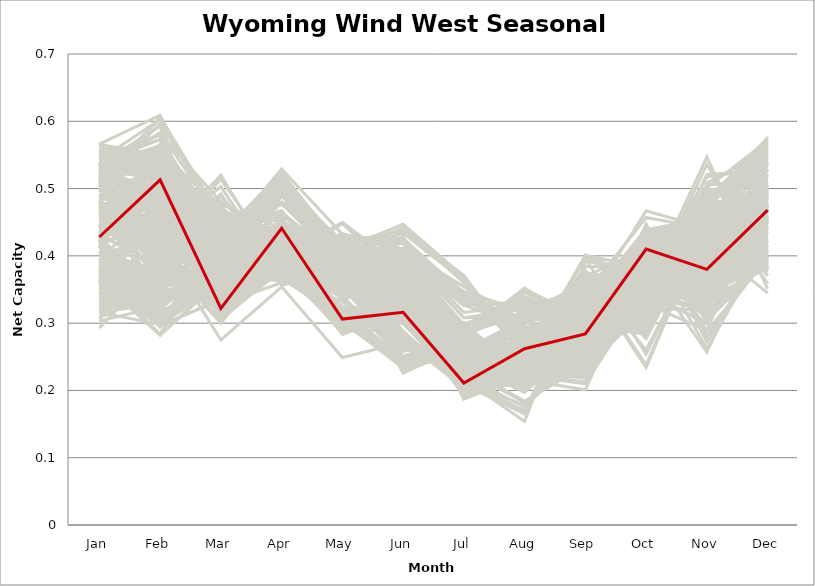
| Category | sample_001 | sample_002 | sample_003 | sample_004 | sample_005 | sample_006 | sample_007 | sample_008 | sample_009 | sample_010 | sample_011 | sample_012 | sample_013 | sample_014 | sample_015 | sample_016 | sample_017 | sample_018 | sample_019 | sample_020 | sample_021 | sample_022 | sample_023 | sample_024 | sample_025 | sample_026 | sample_027 | sample_028 | sample_029 | sample_030 | sample_031 | sample_032 | sample_033 | sample_034 | sample_035 | sample_036 | sample_037 | sample_038 | sample_039 | sample_040 | sample_041 | sample_042 | sample_043 | sample_044 | sample_045 | sample_046 | sample_047 | sample_048 | sample_049 | sample_050 | sample_051 | sample_052 | sample_053 | sample_054 | sample_055 | sample_056 | sample_057 | sample_058 | sample_059 | sample_060 | sample_061 | sample_062 | sample_063 | sample_064 | sample_065 | sample_066 | sample_067 | sample_068 | sample_069 | sample_070 | sample_071 | sample_072 | sample_073 | sample_074 | sample_075 | sample_076 | sample_077 | sample_078 | sample_079 | sample_080 | sample_081 | sample_082 | sample_083 | sample_084 | sample_085 | sample_086 | sample_087 | sample_088 | sample_089 | sample_090 | sample_091 | sample_092 | sample_093 | sample_094 | sample_095 | sample_096 | sample_097 | sample_098 | sample_099 | sample_100 | sample_101 | sample_102 | sample_103 | sample_104 | sample_105 | sample_106 | sample_107 | sample_108 | sample_109 | sample_110 | sample_111 | sample_112 | sample_113 | sample_114 | sample_115 | sample_116 | sample_117 | sample_118 | sample_119 | sample_120 | sample_121 | sample_122 | sample_123 | sample_124 | sample_125 | sample_126 | sample_127 | sample_128 | sample_129 | sample_130 | sample_131 | sample_132 | sample_133 | sample_134 | sample_135 | sample_136 | sample_137 | sample_138 | sample_139 | sample_140 | sample_141 | sample_142 | sample_143 | sample_144 | sample_145 | sample_146 | sample_147 | sample_148 | sample_149 | sample_150 | sample_151 | sample_152 | sample_153 | sample_154 | sample_155 | sample_156 | sample_157 | sample_158 | sample_159 | sample_160 | sample_161 | sample_162 | sample_163 | sample_164 | sample_165 | sample_166 | sample_167 | sample_168 | sample_169 | sample_170 | sample_171 | sample_172 | sample_173 | sample_174 | sample_175 | sample_176 | sample_177 | sample_178 | sample_179 | sample_180 | sample_181 | sample_182 | sample_183 | sample_184 | sample_185 | sample_186 | sample_187 | sample_188 | sample_189 | sample_190 | sample_191 | sample_192 | sample_193 | sample_194 | sample_195 | sample_196 | sample_197 | sample_198 | sample_199 | sample_200 | sample_201 | sample_202 | sample_203 | sample_204 | sample_205 | sample_206 | sample_207 | sample_208 | sample_209 | sample_210 | sample_211 | sample_212 | sample_213 | sample_214 | sample_215 | sample_216 | sample_217 | sample_218 | sample_219 | sample_220 | sample_221 | sample_222 | sample_223 | sample_224 | sample_225 | sample_226 | sample_227 | sample_228 | sample_229 | sample_230 | sample_231 | sample_232 | sample_233 | sample_234 | sample_235 | sample_236 | sample_237 | sample_238 | sample_239 | sample_240 | sample_241 | sample_242 | sample_243 | sample_244 | sample_245 | sample_246 | sample_248 | sample_249 | sample_250 | sample_247 |
|---|---|---|---|---|---|---|---|---|---|---|---|---|---|---|---|---|---|---|---|---|---|---|---|---|---|---|---|---|---|---|---|---|---|---|---|---|---|---|---|---|---|---|---|---|---|---|---|---|---|---|---|---|---|---|---|---|---|---|---|---|---|---|---|---|---|---|---|---|---|---|---|---|---|---|---|---|---|---|---|---|---|---|---|---|---|---|---|---|---|---|---|---|---|---|---|---|---|---|---|---|---|---|---|---|---|---|---|---|---|---|---|---|---|---|---|---|---|---|---|---|---|---|---|---|---|---|---|---|---|---|---|---|---|---|---|---|---|---|---|---|---|---|---|---|---|---|---|---|---|---|---|---|---|---|---|---|---|---|---|---|---|---|---|---|---|---|---|---|---|---|---|---|---|---|---|---|---|---|---|---|---|---|---|---|---|---|---|---|---|---|---|---|---|---|---|---|---|---|---|---|---|---|---|---|---|---|---|---|---|---|---|---|---|---|---|---|---|---|---|---|---|---|---|---|---|---|---|---|---|---|---|---|---|---|---|---|---|---|---|---|---|---|---|---|---|---|---|---|---|---|
| Jan | 0.439 | 0.403 | 0.508 | 0.536 | 0.519 | 0.49 | 0.314 | 0.431 | 0.503 | 0.485 | 0.528 | 0.343 | 0.519 | 0.53 | 0.432 | 0.317 | 0.362 | 0.474 | 0.412 | 0.488 | 0.425 | 0.335 | 0.303 | 0.412 | 0.434 | 0.425 | 0.558 | 0.542 | 0.314 | 0.537 | 0.432 | 0.506 | 0.36 | 0.527 | 0.361 | 0.348 | 0.324 | 0.308 | 0.432 | 0.45 | 0.556 | 0.521 | 0.535 | 0.356 | 0.546 | 0.331 | 0.432 | 0.437 | 0.462 | 0.386 | 0.343 | 0.345 | 0.478 | 0.53 | 0.373 | 0.467 | 0.444 | 0.542 | 0.54 | 0.513 | 0.395 | 0.363 | 0.327 | 0.542 | 0.42 | 0.531 | 0.488 | 0.358 | 0.369 | 0.556 | 0.509 | 0.462 | 0.565 | 0.47 | 0.413 | 0.534 | 0.474 | 0.532 | 0.511 | 0.432 | 0.444 | 0.503 | 0.5 | 0.445 | 0.456 | 0.535 | 0.457 | 0.524 | 0.537 | 0.464 | 0.557 | 0.332 | 0.341 | 0.341 | 0.556 | 0.545 | 0.421 | 0.474 | 0.504 | 0.392 | 0.475 | 0.463 | 0.515 | 0.468 | 0.551 | 0.564 | 0.324 | 0.375 | 0.35 | 0.457 | 0.391 | 0.426 | 0.444 | 0.428 | 0.481 | 0.418 | 0.526 | 0.557 | 0.513 | 0.52 | 0.515 | 0.39 | 0.343 | 0.392 | 0.339 | 0.316 | 0.534 | 0.404 | 0.511 | 0.518 | 0.421 | 0.458 | 0.458 | 0.426 | 0.544 | 0.469 | 0.339 | 0.483 | 0.441 | 0.511 | 0.37 | 0.416 | 0.566 | 0.441 | 0.506 | 0.559 | 0.531 | 0.537 | 0.527 | 0.306 | 0.332 | 0.321 | 0.524 | 0.42 | 0.442 | 0.472 | 0.405 | 0.526 | 0.553 | 0.485 | 0.357 | 0.426 | 0.516 | 0.514 | 0.476 | 0.315 | 0.48 | 0.318 | 0.309 | 0.429 | 0.448 | 0.397 | 0.427 | 0.498 | 0.441 | 0.461 | 0.51 | 0.535 | 0.407 | 0.374 | 0.326 | 0.407 | 0.389 | 0.553 | 0.552 | 0.55 | 0.484 | 0.461 | 0.534 | 0.454 | 0.376 | 0.393 | 0.535 | 0.442 | 0.383 | 0.343 | 0.366 | 0.334 | 0.293 | 0.566 | 0.416 | 0.408 | 0.469 | 0.499 | 0.316 | 0.519 | 0.54 | 0.48 | 0.434 | 0.498 | 0.5 | 0.368 | 0.376 | 0.423 | 0.531 | 0.415 | 0.503 | 0.376 | 0.322 | 0.42 | 0.537 | 0.525 | 0.364 | 0.534 | 0.511 | 0.527 | 0.554 | 0.517 | 0.525 | 0.378 | 0.46 | 0.46 | 0.456 | 0.527 | 0.548 | 0.372 | 0.555 | 0.526 | 0.414 | 0.421 | 0.424 | 0.535 | 0.378 | 0.472 | 0.441 | 0.333 | 0.529 | 0.375 | 0.535 | 0.428 |
| Feb | 0.423 | 0.323 | 0.502 | 0.398 | 0.557 | 0.566 | 0.337 | 0.523 | 0.606 | 0.475 | 0.561 | 0.401 | 0.402 | 0.467 | 0.558 | 0.339 | 0.467 | 0.381 | 0.53 | 0.534 | 0.33 | 0.382 | 0.325 | 0.476 | 0.487 | 0.316 | 0.523 | 0.555 | 0.349 | 0.573 | 0.382 | 0.389 | 0.472 | 0.395 | 0.304 | 0.4 | 0.355 | 0.349 | 0.299 | 0.477 | 0.532 | 0.536 | 0.389 | 0.305 | 0.53 | 0.365 | 0.559 | 0.486 | 0.401 | 0.311 | 0.387 | 0.375 | 0.474 | 0.548 | 0.33 | 0.487 | 0.507 | 0.603 | 0.547 | 0.395 | 0.381 | 0.295 | 0.375 | 0.534 | 0.442 | 0.403 | 0.502 | 0.323 | 0.3 | 0.531 | 0.393 | 0.45 | 0.523 | 0.414 | 0.334 | 0.554 | 0.426 | 0.525 | 0.606 | 0.385 | 0.532 | 0.554 | 0.395 | 0.556 | 0.444 | 0.582 | 0.462 | 0.392 | 0.445 | 0.39 | 0.523 | 0.39 | 0.387 | 0.341 | 0.543 | 0.579 | 0.514 | 0.43 | 0.559 | 0.306 | 0.497 | 0.442 | 0.535 | 0.363 | 0.541 | 0.541 | 0.351 | 0.305 | 0.466 | 0.511 | 0.441 | 0.536 | 0.454 | 0.498 | 0.363 | 0.36 | 0.398 | 0.538 | 0.408 | 0.424 | 0.54 | 0.294 | 0.321 | 0.332 | 0.371 | 0.329 | 0.489 | 0.307 | 0.382 | 0.434 | 0.556 | 0.43 | 0.409 | 0.506 | 0.512 | 0.393 | 0.38 | 0.412 | 0.395 | 0.431 | 0.309 | 0.297 | 0.549 | 0.564 | 0.389 | 0.55 | 0.544 | 0.429 | 0.498 | 0.399 | 0.359 | 0.346 | 0.487 | 0.307 | 0.534 | 0.432 | 0.42 | 0.526 | 0.545 | 0.529 | 0.315 | 0.469 | 0.399 | 0.498 | 0.422 | 0.333 | 0.434 | 0.332 | 0.349 | 0.543 | 0.401 | 0.318 | 0.344 | 0.419 | 0.443 | 0.412 | 0.503 | 0.533 | 0.328 | 0.283 | 0.335 | 0.352 | 0.324 | 0.458 | 0.572 | 0.538 | 0.395 | 0.343 | 0.518 | 0.472 | 0.455 | 0.484 | 0.593 | 0.405 | 0.333 | 0.342 | 0.319 | 0.336 | 0.388 | 0.609 | 0.346 | 0.375 | 0.42 | 0.561 | 0.298 | 0.483 | 0.418 | 0.344 | 0.515 | 0.598 | 0.368 | 0.284 | 0.482 | 0.342 | 0.552 | 0.296 | 0.397 | 0.406 | 0.367 | 0.496 | 0.474 | 0.519 | 0.282 | 0.516 | 0.5 | 0.49 | 0.453 | 0.536 | 0.52 | 0.472 | 0.471 | 0.45 | 0.43 | 0.515 | 0.55 | 0.444 | 0.537 | 0.583 | 0.36 | 0.525 | 0.511 | 0.446 | 0.329 | 0.391 | 0.435 | 0.371 | 0.548 | 0.327 | 0.564 | 0.513 |
| Mar | 0.39 | 0.41 | 0.337 | 0.472 | 0.451 | 0.441 | 0.332 | 0.34 | 0.458 | 0.448 | 0.329 | 0.355 | 0.431 | 0.33 | 0.335 | 0.402 | 0.46 | 0.444 | 0.332 | 0.306 | 0.357 | 0.322 | 0.418 | 0.328 | 0.335 | 0.355 | 0.393 | 0.47 | 0.424 | 0.319 | 0.349 | 0.424 | 0.318 | 0.399 | 0.402 | 0.349 | 0.395 | 0.429 | 0.354 | 0.372 | 0.402 | 0.46 | 0.452 | 0.382 | 0.336 | 0.323 | 0.341 | 0.349 | 0.489 | 0.373 | 0.323 | 0.323 | 0.417 | 0.443 | 0.387 | 0.366 | 0.353 | 0.308 | 0.455 | 0.437 | 0.334 | 0.375 | 0.344 | 0.349 | 0.372 | 0.382 | 0.43 | 0.4 | 0.371 | 0.46 | 0.403 | 0.373 | 0.394 | 0.514 | 0.373 | 0.325 | 0.52 | 0.463 | 0.448 | 0.35 | 0.337 | 0.444 | 0.45 | 0.343 | 0.419 | 0.48 | 0.472 | 0.453 | 0.402 | 0.43 | 0.427 | 0.351 | 0.408 | 0.367 | 0.46 | 0.325 | 0.337 | 0.503 | 0.442 | 0.362 | 0.408 | 0.421 | 0.313 | 0.436 | 0.412 | 0.401 | 0.324 | 0.401 | 0.306 | 0.36 | 0.392 | 0.324 | 0.352 | 0.359 | 0.451 | 0.358 | 0.436 | 0.4 | 0.431 | 0.396 | 0.327 | 0.401 | 0.398 | 0.403 | 0.369 | 0.4 | 0.464 | 0.354 | 0.405 | 0.426 | 0.346 | 0.469 | 0.423 | 0.334 | 0.403 | 0.428 | 0.334 | 0.415 | 0.331 | 0.41 | 0.402 | 0.334 | 0.413 | 0.358 | 0.428 | 0.476 | 0.421 | 0.396 | 0.34 | 0.3 | 0.389 | 0.356 | 0.325 | 0.35 | 0.331 | 0.428 | 0.275 | 0.456 | 0.426 | 0.459 | 0.37 | 0.362 | 0.437 | 0.438 | 0.434 | 0.41 | 0.428 | 0.403 | 0.406 | 0.359 | 0.492 | 0.358 | 0.359 | 0.458 | 0.344 | 0.472 | 0.433 | 0.334 | 0.361 | 0.363 | 0.361 | 0.378 | 0.407 | 0.368 | 0.439 | 0.409 | 0.453 | 0.448 | 0.422 | 0.424 | 0.467 | 0.44 | 0.307 | 0.421 | 0.375 | 0.368 | 0.422 | 0.393 | 0.307 | 0.436 | 0.373 | 0.345 | 0.435 | 0.451 | 0.375 | 0.454 | 0.413 | 0.437 | 0.334 | 0.451 | 0.456 | 0.412 | 0.4 | 0.355 | 0.432 | 0.336 | 0.42 | 0.324 | 0.327 | 0.396 | 0.351 | 0.455 | 0.365 | 0.418 | 0.442 | 0.452 | 0.384 | 0.44 | 0.454 | 0.394 | 0.413 | 0.45 | 0.489 | 0.322 | 0.395 | 0.46 | 0.405 | 0.452 | 0.359 | 0.346 | 0.368 | 0.396 | 0.39 | 0.428 | 0.464 | 0.318 | 0.419 | 0.411 | 0.323 | 0.322 |
| Apr | 0.372 | 0.446 | 0.388 | 0.377 | 0.39 | 0.48 | 0.395 | 0.37 | 0.428 | 0.402 | 0.36 | 0.405 | 0.367 | 0.41 | 0.418 | 0.426 | 0.455 | 0.408 | 0.412 | 0.379 | 0.424 | 0.398 | 0.412 | 0.437 | 0.442 | 0.385 | 0.504 | 0.418 | 0.423 | 0.387 | 0.403 | 0.384 | 0.389 | 0.379 | 0.423 | 0.402 | 0.411 | 0.425 | 0.379 | 0.402 | 0.515 | 0.407 | 0.377 | 0.375 | 0.387 | 0.401 | 0.418 | 0.38 | 0.364 | 0.438 | 0.394 | 0.407 | 0.394 | 0.406 | 0.361 | 0.396 | 0.376 | 0.402 | 0.417 | 0.405 | 0.405 | 0.376 | 0.417 | 0.384 | 0.489 | 0.426 | 0.415 | 0.372 | 0.379 | 0.425 | 0.377 | 0.492 | 0.494 | 0.385 | 0.446 | 0.376 | 0.371 | 0.422 | 0.423 | 0.407 | 0.452 | 0.419 | 0.393 | 0.386 | 0.394 | 0.418 | 0.396 | 0.392 | 0.41 | 0.385 | 0.514 | 0.403 | 0.401 | 0.392 | 0.41 | 0.412 | 0.438 | 0.367 | 0.375 | 0.444 | 0.401 | 0.497 | 0.391 | 0.384 | 0.505 | 0.511 | 0.396 | 0.43 | 0.399 | 0.386 | 0.479 | 0.425 | 0.368 | 0.371 | 0.388 | 0.402 | 0.397 | 0.497 | 0.399 | 0.424 | 0.378 | 0.409 | 0.387 | 0.444 | 0.408 | 0.414 | 0.402 | 0.442 | 0.385 | 0.385 | 0.414 | 0.393 | 0.492 | 0.445 | 0.497 | 0.478 | 0.404 | 0.506 | 0.406 | 0.378 | 0.432 | 0.385 | 0.517 | 0.396 | 0.376 | 0.441 | 0.508 | 0.418 | 0.408 | 0.414 | 0.432 | 0.393 | 0.395 | 0.388 | 0.46 | 0.495 | 0.354 | 0.395 | 0.524 | 0.438 | 0.368 | 0.403 | 0.388 | 0.405 | 0.381 | 0.395 | 0.384 | 0.417 | 0.433 | 0.423 | 0.356 | 0.448 | 0.413 | 0.385 | 0.413 | 0.398 | 0.479 | 0.395 | 0.441 | 0.432 | 0.399 | 0.388 | 0.441 | 0.431 | 0.467 | 0.513 | 0.382 | 0.382 | 0.516 | 0.388 | 0.435 | 0.464 | 0.381 | 0.529 | 0.376 | 0.398 | 0.367 | 0.422 | 0.413 | 0.467 | 0.393 | 0.432 | 0.384 | 0.476 | 0.366 | 0.403 | 0.411 | 0.381 | 0.457 | 0.436 | 0.369 | 0.426 | 0.462 | 0.423 | 0.523 | 0.377 | 0.386 | 0.401 | 0.394 | 0.489 | 0.434 | 0.38 | 0.364 | 0.516 | 0.391 | 0.41 | 0.443 | 0.489 | 0.398 | 0.465 | 0.527 | 0.41 | 0.391 | 0.379 | 0.5 | 0.451 | 0.508 | 0.403 | 0.4 | 0.376 | 0.366 | 0.418 | 0.377 | 0.375 | 0.373 | 0.407 | 0.517 | 0.433 | 0.378 | 0.441 |
| May | 0.432 | 0.362 | 0.358 | 0.306 | 0.345 | 0.423 | 0.433 | 0.315 | 0.377 | 0.38 | 0.405 | 0.41 | 0.332 | 0.325 | 0.317 | 0.392 | 0.367 | 0.301 | 0.308 | 0.416 | 0.403 | 0.429 | 0.407 | 0.317 | 0.303 | 0.365 | 0.406 | 0.357 | 0.404 | 0.389 | 0.392 | 0.393 | 0.448 | 0.379 | 0.387 | 0.406 | 0.403 | 0.392 | 0.378 | 0.292 | 0.404 | 0.363 | 0.321 | 0.38 | 0.355 | 0.422 | 0.316 | 0.289 | 0.392 | 0.407 | 0.427 | 0.432 | 0.359 | 0.353 | 0.393 | 0.283 | 0.293 | 0.375 | 0.345 | 0.377 | 0.407 | 0.365 | 0.406 | 0.389 | 0.409 | 0.399 | 0.393 | 0.391 | 0.361 | 0.349 | 0.352 | 0.379 | 0.391 | 0.378 | 0.388 | 0.378 | 0.382 | 0.364 | 0.379 | 0.399 | 0.305 | 0.362 | 0.299 | 0.308 | 0.371 | 0.347 | 0.365 | 0.303 | 0.388 | 0.38 | 0.391 | 0.416 | 0.402 | 0.395 | 0.342 | 0.388 | 0.316 | 0.377 | 0.362 | 0.406 | 0.402 | 0.361 | 0.389 | 0.406 | 0.422 | 0.419 | 0.404 | 0.379 | 0.45 | 0.285 | 0.411 | 0.304 | 0.304 | 0.305 | 0.313 | 0.415 | 0.377 | 0.414 | 0.378 | 0.399 | 0.39 | 0.393 | 0.378 | 0.371 | 0.397 | 0.392 | 0.355 | 0.409 | 0.355 | 0.361 | 0.308 | 0.368 | 0.36 | 0.305 | 0.41 | 0.387 | 0.422 | 0.406 | 0.397 | 0.362 | 0.386 | 0.385 | 0.416 | 0.318 | 0.34 | 0.428 | 0.404 | 0.395 | 0.335 | 0.42 | 0.4 | 0.417 | 0.352 | 0.366 | 0.296 | 0.358 | 0.249 | 0.354 | 0.405 | 0.426 | 0.379 | 0.291 | 0.339 | 0.36 | 0.365 | 0.388 | 0.365 | 0.403 | 0.407 | 0.3 | 0.384 | 0.409 | 0.407 | 0.369 | 0.385 | 0.363 | 0.423 | 0.358 | 0.396 | 0.395 | 0.404 | 0.415 | 0.375 | 0.39 | 0.344 | 0.409 | 0.362 | 0.311 | 0.404 | 0.367 | 0.365 | 0.382 | 0.385 | 0.432 | 0.377 | 0.398 | 0.382 | 0.395 | 0.41 | 0.356 | 0.405 | 0.386 | 0.377 | 0.418 | 0.392 | 0.369 | 0.392 | 0.317 | 0.306 | 0.377 | 0.321 | 0.391 | 0.385 | 0.405 | 0.409 | 0.382 | 0.398 | 0.431 | 0.403 | 0.399 | 0.306 | 0.371 | 0.37 | 0.402 | 0.369 | 0.346 | 0.396 | 0.415 | 0.352 | 0.391 | 0.345 | 0.377 | 0.38 | 0.397 | 0.409 | 0.381 | 0.416 | 0.337 | 0.414 | 0.314 | 0.309 | 0.393 | 0.38 | 0.392 | 0.365 | 0.404 | 0.411 | 0.367 | 0.39 | 0.306 |
| Jun | 0.372 | 0.322 | 0.281 | 0.239 | 0.344 | 0.34 | 0.41 | 0.299 | 0.382 | 0.339 | 0.287 | 0.411 | 0.258 | 0.267 | 0.315 | 0.401 | 0.399 | 0.237 | 0.325 | 0.284 | 0.343 | 0.423 | 0.394 | 0.342 | 0.331 | 0.359 | 0.362 | 0.391 | 0.389 | 0.278 | 0.409 | 0.365 | 0.367 | 0.242 | 0.321 | 0.399 | 0.406 | 0.392 | 0.358 | 0.287 | 0.37 | 0.375 | 0.247 | 0.335 | 0.275 | 0.419 | 0.311 | 0.314 | 0.325 | 0.313 | 0.426 | 0.406 | 0.354 | 0.352 | 0.368 | 0.317 | 0.31 | 0.322 | 0.367 | 0.403 | 0.359 | 0.346 | 0.4 | 0.316 | 0.331 | 0.24 | 0.342 | 0.336 | 0.356 | 0.35 | 0.259 | 0.314 | 0.364 | 0.341 | 0.327 | 0.274 | 0.342 | 0.372 | 0.377 | 0.408 | 0.328 | 0.367 | 0.242 | 0.304 | 0.362 | 0.385 | 0.349 | 0.233 | 0.247 | 0.364 | 0.383 | 0.404 | 0.4 | 0.4 | 0.361 | 0.32 | 0.324 | 0.331 | 0.347 | 0.311 | 0.332 | 0.325 | 0.281 | 0.378 | 0.395 | 0.372 | 0.442 | 0.31 | 0.381 | 0.323 | 0.364 | 0.31 | 0.317 | 0.308 | 0.244 | 0.36 | 0.396 | 0.386 | 0.361 | 0.24 | 0.285 | 0.31 | 0.336 | 0.318 | 0.402 | 0.4 | 0.352 | 0.309 | 0.25 | 0.265 | 0.322 | 0.339 | 0.333 | 0.336 | 0.37 | 0.321 | 0.395 | 0.311 | 0.419 | 0.264 | 0.33 | 0.356 | 0.369 | 0.316 | 0.251 | 0.328 | 0.365 | 0.236 | 0.273 | 0.437 | 0.388 | 0.407 | 0.273 | 0.358 | 0.331 | 0.324 | 0.271 | 0.367 | 0.354 | 0.313 | 0.353 | 0.3 | 0.247 | 0.348 | 0.357 | 0.385 | 0.362 | 0.395 | 0.401 | 0.314 | 0.333 | 0.309 | 0.353 | 0.361 | 0.429 | 0.314 | 0.345 | 0.279 | 0.341 | 0.31 | 0.409 | 0.377 | 0.314 | 0.238 | 0.354 | 0.381 | 0.352 | 0.241 | 0.36 | 0.353 | 0.393 | 0.386 | 0.309 | 0.332 | 0.351 | 0.408 | 0.348 | 0.391 | 0.447 | 0.354 | 0.372 | 0.354 | 0.368 | 0.342 | 0.325 | 0.375 | 0.231 | 0.239 | 0.35 | 0.374 | 0.241 | 0.322 | 0.377 | 0.352 | 0.363 | 0.351 | 0.377 | 0.367 | 0.441 | 0.353 | 0.282 | 0.344 | 0.349 | 0.376 | 0.344 | 0.353 | 0.232 | 0.346 | 0.338 | 0.37 | 0.32 | 0.351 | 0.341 | 0.311 | 0.394 | 0.403 | 0.374 | 0.349 | 0.397 | 0.307 | 0.321 | 0.226 | 0.338 | 0.359 | 0.325 | 0.434 | 0.383 | 0.317 | 0.288 | 0.316 |
| Jul | 0.258 | 0.255 | 0.213 | 0.285 | 0.246 | 0.238 | 0.354 | 0.208 | 0.234 | 0.255 | 0.209 | 0.336 | 0.281 | 0.216 | 0.193 | 0.294 | 0.223 | 0.283 | 0.204 | 0.203 | 0.258 | 0.343 | 0.283 | 0.211 | 0.215 | 0.275 | 0.255 | 0.231 | 0.277 | 0.204 | 0.246 | 0.212 | 0.259 | 0.266 | 0.266 | 0.327 | 0.308 | 0.278 | 0.282 | 0.206 | 0.26 | 0.221 | 0.278 | 0.225 | 0.204 | 0.338 | 0.193 | 0.215 | 0.255 | 0.271 | 0.344 | 0.345 | 0.191 | 0.255 | 0.232 | 0.197 | 0.208 | 0.192 | 0.219 | 0.225 | 0.28 | 0.263 | 0.334 | 0.209 | 0.21 | 0.268 | 0.254 | 0.22 | 0.248 | 0.252 | 0.267 | 0.217 | 0.25 | 0.244 | 0.264 | 0.205 | 0.258 | 0.232 | 0.229 | 0.246 | 0.199 | 0.233 | 0.29 | 0.213 | 0.196 | 0.225 | 0.25 | 0.287 | 0.261 | 0.205 | 0.257 | 0.344 | 0.284 | 0.326 | 0.24 | 0.202 | 0.205 | 0.24 | 0.242 | 0.276 | 0.248 | 0.226 | 0.204 | 0.204 | 0.255 | 0.267 | 0.36 | 0.267 | 0.253 | 0.205 | 0.209 | 0.2 | 0.216 | 0.213 | 0.295 | 0.247 | 0.231 | 0.265 | 0.194 | 0.263 | 0.217 | 0.272 | 0.227 | 0.256 | 0.308 | 0.298 | 0.233 | 0.266 | 0.269 | 0.25 | 0.198 | 0.247 | 0.228 | 0.216 | 0.255 | 0.223 | 0.355 | 0.208 | 0.251 | 0.268 | 0.271 | 0.284 | 0.253 | 0.205 | 0.282 | 0.283 | 0.24 | 0.258 | 0.211 | 0.371 | 0.278 | 0.347 | 0.214 | 0.273 | 0.202 | 0.228 | 0.232 | 0.218 | 0.24 | 0.248 | 0.253 | 0.204 | 0.278 | 0.257 | 0.197 | 0.277 | 0.192 | 0.283 | 0.284 | 0.205 | 0.246 | 0.273 | 0.254 | 0.187 | 0.242 | 0.242 | 0.245 | 0.215 | 0.263 | 0.267 | 0.331 | 0.252 | 0.258 | 0.261 | 0.269 | 0.268 | 0.197 | 0.301 | 0.26 | 0.193 | 0.235 | 0.213 | 0.199 | 0.213 | 0.224 | 0.316 | 0.232 | 0.294 | 0.369 | 0.279 | 0.245 | 0.27 | 0.195 | 0.232 | 0.231 | 0.242 | 0.257 | 0.295 | 0.211 | 0.246 | 0.295 | 0.276 | 0.218 | 0.259 | 0.243 | 0.292 | 0.223 | 0.283 | 0.367 | 0.209 | 0.212 | 0.256 | 0.259 | 0.256 | 0.26 | 0.253 | 0.268 | 0.244 | 0.243 | 0.209 | 0.238 | 0.255 | 0.255 | 0.202 | 0.256 | 0.231 | 0.253 | 0.248 | 0.251 | 0.21 | 0.208 | 0.267 | 0.228 | 0.203 | 0.238 | 0.363 | 0.249 | 0.262 | 0.206 | 0.211 |
| Aug | 0.223 | 0.271 | 0.229 | 0.208 | 0.294 | 0.248 | 0.304 | 0.256 | 0.252 | 0.219 | 0.224 | 0.304 | 0.223 | 0.238 | 0.239 | 0.328 | 0.175 | 0.2 | 0.267 | 0.245 | 0.261 | 0.27 | 0.35 | 0.261 | 0.254 | 0.231 | 0.211 | 0.267 | 0.347 | 0.234 | 0.264 | 0.229 | 0.239 | 0.271 | 0.267 | 0.292 | 0.321 | 0.334 | 0.22 | 0.242 | 0.216 | 0.26 | 0.21 | 0.241 | 0.214 | 0.276 | 0.252 | 0.248 | 0.22 | 0.258 | 0.26 | 0.281 | 0.221 | 0.29 | 0.245 | 0.232 | 0.235 | 0.224 | 0.253 | 0.221 | 0.21 | 0.256 | 0.307 | 0.217 | 0.169 | 0.259 | 0.216 | 0.248 | 0.252 | 0.291 | 0.25 | 0.154 | 0.216 | 0.207 | 0.248 | 0.23 | 0.214 | 0.27 | 0.237 | 0.258 | 0.243 | 0.26 | 0.204 | 0.247 | 0.221 | 0.262 | 0.224 | 0.202 | 0.25 | 0.236 | 0.219 | 0.301 | 0.314 | 0.332 | 0.274 | 0.227 | 0.247 | 0.197 | 0.292 | 0.259 | 0.214 | 0.307 | 0.238 | 0.231 | 0.21 | 0.219 | 0.256 | 0.283 | 0.24 | 0.23 | 0.17 | 0.25 | 0.251 | 0.252 | 0.219 | 0.278 | 0.226 | 0.229 | 0.216 | 0.254 | 0.239 | 0.262 | 0.251 | 0.273 | 0.31 | 0.335 | 0.292 | 0.264 | 0.251 | 0.24 | 0.249 | 0.228 | 0.32 | 0.242 | 0.22 | 0.303 | 0.286 | 0.32 | 0.253 | 0.227 | 0.284 | 0.231 | 0.215 | 0.254 | 0.231 | 0.252 | 0.21 | 0.25 | 0.224 | 0.248 | 0.34 | 0.317 | 0.238 | 0.233 | 0.244 | 0.314 | 0.231 | 0.283 | 0.224 | 0.255 | 0.256 | 0.249 | 0.232 | 0.307 | 0.213 | 0.346 | 0.215 | 0.352 | 0.339 | 0.248 | 0.222 | 0.26 | 0.257 | 0.222 | 0.256 | 0.218 | 0.24 | 0.233 | 0.255 | 0.265 | 0.326 | 0.26 | 0.272 | 0.244 | 0.241 | 0.23 | 0.229 | 0.219 | 0.212 | 0.228 | 0.184 | 0.178 | 0.245 | 0.328 | 0.256 | 0.327 | 0.249 | 0.33 | 0.254 | 0.232 | 0.26 | 0.213 | 0.213 | 0.249 | 0.269 | 0.29 | 0.244 | 0.226 | 0.247 | 0.259 | 0.22 | 0.275 | 0.169 | 0.26 | 0.213 | 0.222 | 0.227 | 0.206 | 0.247 | 0.165 | 0.238 | 0.304 | 0.271 | 0.222 | 0.306 | 0.297 | 0.253 | 0.235 | 0.278 | 0.169 | 0.321 | 0.221 | 0.223 | 0.242 | 0.22 | 0.182 | 0.206 | 0.288 | 0.264 | 0.259 | 0.259 | 0.261 | 0.246 | 0.239 | 0.2 | 0.248 | 0.21 | 0.27 | 0.229 | 0.262 |
| Sep | 0.377 | 0.278 | 0.331 | 0.33 | 0.227 | 0.226 | 0.361 | 0.335 | 0.299 | 0.294 | 0.332 | 0.324 | 0.335 | 0.343 | 0.313 | 0.301 | 0.265 | 0.355 | 0.316 | 0.337 | 0.349 | 0.348 | 0.308 | 0.278 | 0.277 | 0.269 | 0.278 | 0.264 | 0.302 | 0.337 | 0.351 | 0.218 | 0.252 | 0.273 | 0.31 | 0.319 | 0.305 | 0.293 | 0.273 | 0.401 | 0.278 | 0.279 | 0.332 | 0.325 | 0.324 | 0.361 | 0.298 | 0.385 | 0.292 | 0.358 | 0.352 | 0.356 | 0.238 | 0.234 | 0.331 | 0.401 | 0.367 | 0.315 | 0.269 | 0.21 | 0.254 | 0.299 | 0.32 | 0.34 | 0.362 | 0.26 | 0.267 | 0.318 | 0.291 | 0.228 | 0.309 | 0.393 | 0.274 | 0.284 | 0.349 | 0.328 | 0.269 | 0.273 | 0.312 | 0.34 | 0.278 | 0.316 | 0.333 | 0.352 | 0.241 | 0.278 | 0.271 | 0.339 | 0.269 | 0.237 | 0.258 | 0.325 | 0.289 | 0.316 | 0.236 | 0.32 | 0.279 | 0.282 | 0.239 | 0.353 | 0.299 | 0.365 | 0.336 | 0.22 | 0.262 | 0.275 | 0.37 | 0.322 | 0.243 | 0.369 | 0.346 | 0.313 | 0.384 | 0.368 | 0.358 | 0.364 | 0.212 | 0.277 | 0.201 | 0.266 | 0.335 | 0.339 | 0.309 | 0.275 | 0.303 | 0.314 | 0.255 | 0.368 | 0.3 | 0.279 | 0.304 | 0.273 | 0.352 | 0.274 | 0.277 | 0.312 | 0.335 | 0.297 | 0.373 | 0.267 | 0.321 | 0.27 | 0.275 | 0.324 | 0.332 | 0.296 | 0.287 | 0.262 | 0.326 | 0.373 | 0.302 | 0.33 | 0.338 | 0.269 | 0.266 | 0.36 | 0.314 | 0.282 | 0.287 | 0.264 | 0.308 | 0.398 | 0.326 | 0.247 | 0.241 | 0.299 | 0.245 | 0.297 | 0.297 | 0.283 | 0.291 | 0.355 | 0.341 | 0.228 | 0.359 | 0.287 | 0.25 | 0.326 | 0.338 | 0.348 | 0.324 | 0.336 | 0.312 | 0.256 | 0.296 | 0.277 | 0.232 | 0.369 | 0.282 | 0.23 | 0.237 | 0.272 | 0.32 | 0.304 | 0.323 | 0.315 | 0.318 | 0.311 | 0.371 | 0.327 | 0.338 | 0.26 | 0.247 | 0.221 | 0.349 | 0.288 | 0.259 | 0.358 | 0.258 | 0.317 | 0.35 | 0.33 | 0.31 | 0.364 | 0.279 | 0.262 | 0.229 | 0.245 | 0.378 | 0.342 | 0.322 | 0.246 | 0.301 | 0.279 | 0.228 | 0.25 | 0.261 | 0.252 | 0.231 | 0.328 | 0.354 | 0.274 | 0.268 | 0.327 | 0.26 | 0.25 | 0.272 | 0.224 | 0.354 | 0.35 | 0.357 | 0.261 | 0.307 | 0.222 | 0.28 | 0.396 | 0.267 | 0.304 | 0.326 | 0.284 |
| Oct | 0.322 | 0.427 | 0.436 | 0.424 | 0.335 | 0.432 | 0.302 | 0.395 | 0.283 | 0.314 | 0.411 | 0.296 | 0.424 | 0.457 | 0.417 | 0.31 | 0.387 | 0.422 | 0.401 | 0.426 | 0.356 | 0.293 | 0.311 | 0.441 | 0.436 | 0.322 | 0.377 | 0.299 | 0.304 | 0.434 | 0.347 | 0.372 | 0.387 | 0.401 | 0.4 | 0.297 | 0.317 | 0.315 | 0.333 | 0.382 | 0.379 | 0.316 | 0.419 | 0.387 | 0.437 | 0.3 | 0.417 | 0.378 | 0.385 | 0.399 | 0.297 | 0.296 | 0.376 | 0.319 | 0.305 | 0.365 | 0.376 | 0.369 | 0.32 | 0.35 | 0.447 | 0.308 | 0.302 | 0.36 | 0.365 | 0.402 | 0.297 | 0.364 | 0.31 | 0.332 | 0.43 | 0.369 | 0.38 | 0.4 | 0.392 | 0.44 | 0.391 | 0.312 | 0.3 | 0.338 | 0.437 | 0.308 | 0.398 | 0.389 | 0.385 | 0.318 | 0.375 | 0.418 | 0.403 | 0.382 | 0.35 | 0.291 | 0.331 | 0.302 | 0.32 | 0.349 | 0.423 | 0.401 | 0.363 | 0.375 | 0.3 | 0.341 | 0.414 | 0.39 | 0.359 | 0.372 | 0.26 | 0.409 | 0.419 | 0.38 | 0.34 | 0.406 | 0.386 | 0.381 | 0.405 | 0.353 | 0.355 | 0.369 | 0.407 | 0.389 | 0.429 | 0.397 | 0.364 | 0.409 | 0.313 | 0.307 | 0.317 | 0.384 | 0.441 | 0.415 | 0.408 | 0.384 | 0.34 | 0.439 | 0.375 | 0.376 | 0.304 | 0.369 | 0.329 | 0.417 | 0.396 | 0.316 | 0.385 | 0.391 | 0.405 | 0.327 | 0.403 | 0.417 | 0.439 | 0.238 | 0.309 | 0.298 | 0.432 | 0.331 | 0.426 | 0.343 | 0.287 | 0.317 | 0.396 | 0.438 | 0.307 | 0.367 | 0.42 | 0.324 | 0.378 | 0.302 | 0.38 | 0.307 | 0.308 | 0.413 | 0.389 | 0.389 | 0.364 | 0.4 | 0.323 | 0.424 | 0.423 | 0.431 | 0.38 | 0.382 | 0.305 | 0.347 | 0.405 | 0.402 | 0.353 | 0.347 | 0.386 | 0.412 | 0.387 | 0.396 | 0.399 | 0.378 | 0.384 | 0.36 | 0.309 | 0.301 | 0.338 | 0.304 | 0.234 | 0.345 | 0.348 | 0.436 | 0.376 | 0.426 | 0.36 | 0.317 | 0.41 | 0.417 | 0.44 | 0.284 | 0.404 | 0.398 | 0.349 | 0.358 | 0.39 | 0.326 | 0.363 | 0.447 | 0.277 | 0.343 | 0.467 | 0.338 | 0.31 | 0.381 | 0.337 | 0.317 | 0.389 | 0.419 | 0.33 | 0.333 | 0.319 | 0.353 | 0.386 | 0.381 | 0.363 | 0.382 | 0.376 | 0.335 | 0.34 | 0.392 | 0.374 | 0.404 | 0.361 | 0.399 | 0.417 | 0.254 | 0.383 | 0.396 | 0.433 | 0.41 |
| Nov | 0.384 | 0.381 | 0.445 | 0.353 | 0.483 | 0.464 | 0.42 | 0.398 | 0.458 | 0.473 | 0.409 | 0.465 | 0.307 | 0.44 | 0.409 | 0.49 | 0.382 | 0.336 | 0.395 | 0.407 | 0.333 | 0.448 | 0.474 | 0.344 | 0.352 | 0.452 | 0.457 | 0.453 | 0.489 | 0.418 | 0.299 | 0.374 | 0.257 | 0.342 | 0.355 | 0.461 | 0.488 | 0.47 | 0.426 | 0.408 | 0.487 | 0.42 | 0.332 | 0.498 | 0.435 | 0.435 | 0.406 | 0.399 | 0.427 | 0.327 | 0.451 | 0.446 | 0.394 | 0.479 | 0.49 | 0.409 | 0.408 | 0.469 | 0.399 | 0.366 | 0.28 | 0.463 | 0.455 | 0.469 | 0.364 | 0.337 | 0.503 | 0.489 | 0.477 | 0.508 | 0.306 | 0.36 | 0.469 | 0.448 | 0.342 | 0.43 | 0.444 | 0.444 | 0.439 | 0.303 | 0.381 | 0.398 | 0.358 | 0.406 | 0.389 | 0.428 | 0.458 | 0.344 | 0.342 | 0.378 | 0.468 | 0.454 | 0.488 | 0.468 | 0.482 | 0.496 | 0.385 | 0.417 | 0.483 | 0.332 | 0.484 | 0.362 | 0.427 | 0.358 | 0.474 | 0.471 | 0.434 | 0.351 | 0.262 | 0.433 | 0.362 | 0.393 | 0.388 | 0.405 | 0.319 | 0.326 | 0.373 | 0.478 | 0.36 | 0.368 | 0.418 | 0.332 | 0.517 | 0.374 | 0.468 | 0.474 | 0.44 | 0.324 | 0.288 | 0.348 | 0.401 | 0.44 | 0.346 | 0.362 | 0.472 | 0.385 | 0.445 | 0.412 | 0.289 | 0.343 | 0.357 | 0.441 | 0.47 | 0.423 | 0.311 | 0.46 | 0.45 | 0.359 | 0.456 | 0.447 | 0.48 | 0.433 | 0.441 | 0.451 | 0.399 | 0.351 | 0.466 | 0.408 | 0.463 | 0.447 | 0.475 | 0.41 | 0.31 | 0.471 | 0.386 | 0.463 | 0.399 | 0.472 | 0.477 | 0.429 | 0.423 | 0.326 | 0.33 | 0.39 | 0.319 | 0.406 | 0.445 | 0.43 | 0.32 | 0.322 | 0.457 | 0.334 | 0.355 | 0.353 | 0.547 | 0.467 | 0.393 | 0.307 | 0.458 | 0.392 | 0.377 | 0.397 | 0.452 | 0.417 | 0.485 | 0.466 | 0.521 | 0.482 | 0.449 | 0.536 | 0.319 | 0.314 | 0.4 | 0.457 | 0.485 | 0.427 | 0.358 | 0.304 | 0.37 | 0.437 | 0.327 | 0.347 | 0.392 | 0.331 | 0.457 | 0.439 | 0.373 | 0.272 | 0.451 | 0.377 | 0.441 | 0.485 | 0.453 | 0.465 | 0.451 | 0.454 | 0.361 | 0.462 | 0.486 | 0.384 | 0.389 | 0.456 | 0.441 | 0.455 | 0.467 | 0.377 | 0.482 | 0.501 | 0.319 | 0.407 | 0.417 | 0.364 | 0.505 | 0.355 | 0.41 | 0.442 | 0.484 | 0.376 | 0.439 | 0.38 |
| Dec | 0.444 | 0.451 | 0.404 | 0.389 | 0.574 | 0.425 | 0.397 | 0.484 | 0.488 | 0.389 | 0.428 | 0.405 | 0.401 | 0.403 | 0.473 | 0.443 | 0.458 | 0.382 | 0.467 | 0.418 | 0.46 | 0.377 | 0.477 | 0.476 | 0.477 | 0.504 | 0.381 | 0.567 | 0.488 | 0.402 | 0.506 | 0.44 | 0.451 | 0.404 | 0.445 | 0.402 | 0.402 | 0.479 | 0.528 | 0.505 | 0.389 | 0.571 | 0.41 | 0.506 | 0.394 | 0.385 | 0.48 | 0.477 | 0.435 | 0.475 | 0.38 | 0.379 | 0.414 | 0.569 | 0.545 | 0.493 | 0.483 | 0.421 | 0.528 | 0.443 | 0.4 | 0.538 | 0.392 | 0.406 | 0.519 | 0.414 | 0.371 | 0.512 | 0.541 | 0.557 | 0.4 | 0.55 | 0.402 | 0.456 | 0.474 | 0.402 | 0.433 | 0.563 | 0.474 | 0.496 | 0.478 | 0.488 | 0.4 | 0.501 | 0.404 | 0.539 | 0.411 | 0.387 | 0.413 | 0.43 | 0.383 | 0.404 | 0.424 | 0.395 | 0.575 | 0.405 | 0.468 | 0.459 | 0.558 | 0.474 | 0.359 | 0.461 | 0.419 | 0.435 | 0.387 | 0.378 | 0.386 | 0.452 | 0.422 | 0.471 | 0.538 | 0.457 | 0.469 | 0.471 | 0.389 | 0.47 | 0.436 | 0.37 | 0.436 | 0.412 | 0.386 | 0.456 | 0.53 | 0.448 | 0.407 | 0.438 | 0.544 | 0.473 | 0.397 | 0.395 | 0.486 | 0.406 | 0.454 | 0.495 | 0.389 | 0.422 | 0.379 | 0.387 | 0.501 | 0.392 | 0.457 | 0.513 | 0.414 | 0.509 | 0.402 | 0.392 | 0.423 | 0.407 | 0.408 | 0.411 | 0.475 | 0.412 | 0.413 | 0.498 | 0.479 | 0.454 | 0.456 | 0.577 | 0.418 | 0.433 | 0.541 | 0.49 | 0.41 | 0.562 | 0.399 | 0.486 | 0.401 | 0.467 | 0.465 | 0.467 | 0.446 | 0.459 | 0.456 | 0.408 | 0.498 | 0.458 | 0.436 | 0.392 | 0.487 | 0.476 | 0.387 | 0.486 | 0.45 | 0.414 | 0.351 | 0.38 | 0.405 | 0.399 | 0.42 | 0.388 | 0.435 | 0.466 | 0.408 | 0.345 | 0.542 | 0.401 | 0.527 | 0.438 | 0.42 | 0.381 | 0.475 | 0.399 | 0.397 | 0.426 | 0.535 | 0.554 | 0.4 | 0.394 | 0.486 | 0.49 | 0.388 | 0.443 | 0.504 | 0.457 | 0.429 | 0.513 | 0.445 | 0.416 | 0.382 | 0.53 | 0.428 | 0.556 | 0.538 | 0.419 | 0.555 | 0.547 | 0.418 | 0.44 | 0.564 | 0.522 | 0.468 | 0.403 | 0.419 | 0.412 | 0.384 | 0.469 | 0.392 | 0.571 | 0.49 | 0.491 | 0.491 | 0.403 | 0.514 | 0.423 | 0.465 | 0.392 | 0.433 | 0.461 | 0.401 | 0.468 |